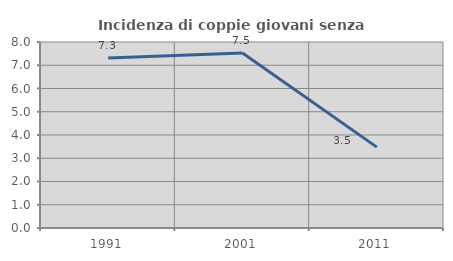
| Category | Incidenza di coppie giovani senza figli |
|---|---|
| 1991.0 | 7.317 |
| 2001.0 | 7.527 |
| 2011.0 | 3.478 |